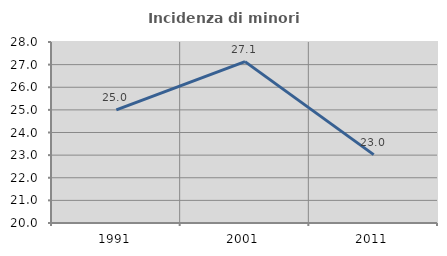
| Category | Incidenza di minori stranieri |
|---|---|
| 1991.0 | 25 |
| 2001.0 | 27.133 |
| 2011.0 | 23.021 |